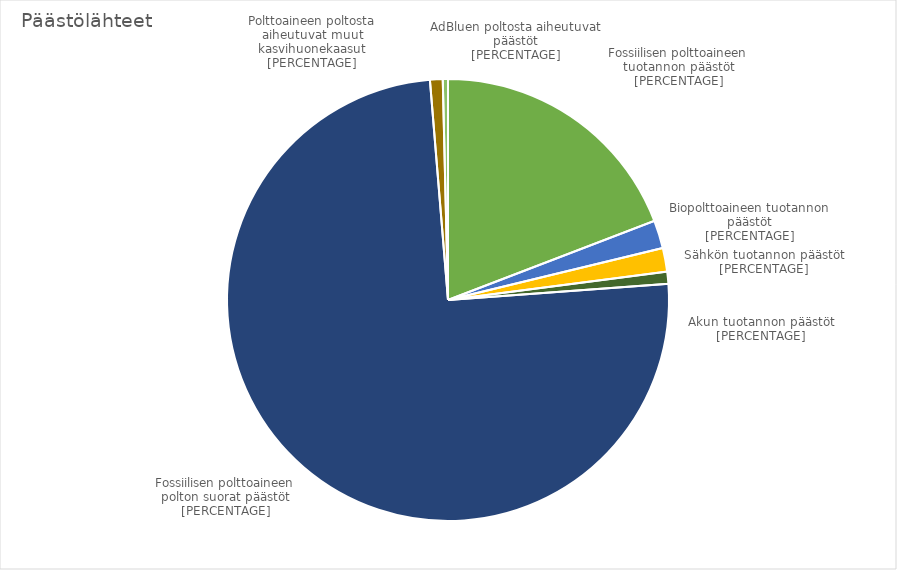
| Category | Päästölähteet |
|---|---|
| Fossiilisen polttoaineen tuotanto | 68.615 |
| Biopolttoaineen tuotanto | 7.333 |
| Sähkön tuotanto | 6.182 |
| Akun tuotanto | 3.175 |
| Fossiilisen polttoaineen poltto | 267.956 |
| Polttoaineen polton muut khk-päästöt | 3.317 |
| Urean käytön päästöt | 1.357 |